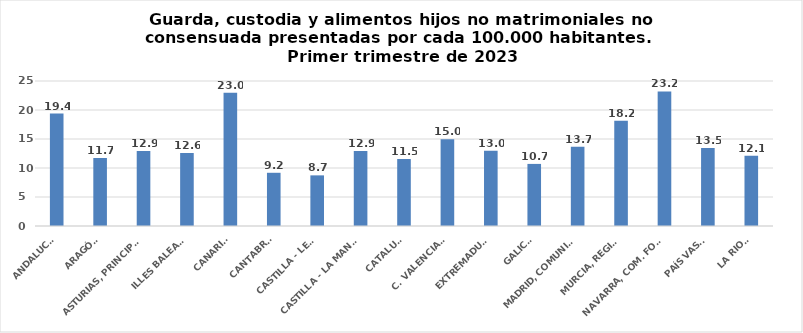
| Category | Series 0 |
|---|---|
| ANDALUCÍA | 19.382 |
| ARAGÓN | 11.71 |
| ASTURIAS, PRINCIPADO | 12.915 |
| ILLES BALEARS | 12.596 |
| CANARIAS | 22.956 |
| CANTABRIA | 9.175 |
| CASTILLA - LEÓN | 8.73 |
| CASTILLA - LA MANCHA | 12.929 |
| CATALUÑA | 11.533 |
| C. VALENCIANA | 14.967 |
| EXTREMADURA | 12.994 |
| GALICIA | 10.705 |
| MADRID, COMUNIDAD | 13.666 |
| MURCIA, REGIÓN | 18.162 |
| NAVARRA, COM. FORAL | 23.207 |
| PAÍS VASCO | 13.469 |
| LA RIOJA | 12.102 |